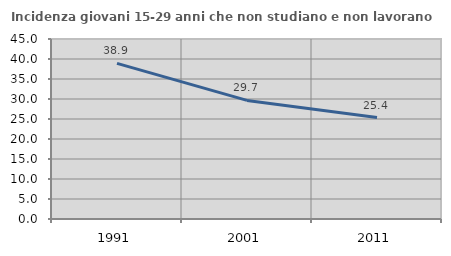
| Category | Incidenza giovani 15-29 anni che non studiano e non lavorano  |
|---|---|
| 1991.0 | 38.911 |
| 2001.0 | 29.652 |
| 2011.0 | 25.373 |